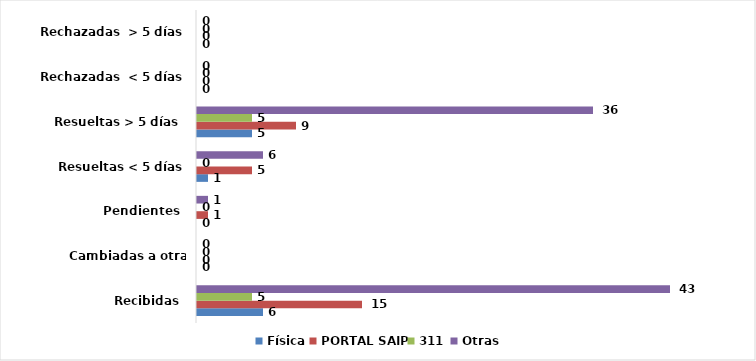
| Category | Física | PORTAL SAIP | 311 | Otras |
|---|---|---|---|---|
| Recibidas  | 6 | 15 | 5 | 43 |
| Cambiadas a otra institución | 0 | 0 | 0 | 0 |
| Pendientes  | 0 | 1 | 0 | 1 |
| Resueltas < 5 días | 1 | 5 | 0 | 6 |
| Resueltas > 5 días  | 5 | 9 | 5 | 36 |
| Rechazadas  < 5 días | 0 | 0 | 0 | 0 |
| Rechazadas  > 5 días | 0 | 0 | 0 | 0 |